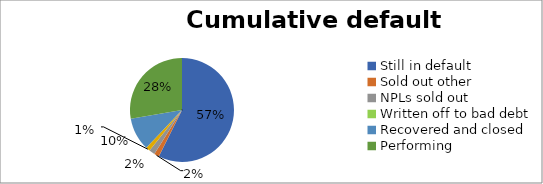
| Category | Series 1 | Series 0 |
|---|---|---|
| 0 | 0.574 |  |
| 1 | 0.016 |  |
| 2 | 0.018 |  |
| 3 | 0.013 |  |
| 4 | 0.102 |  |
| 5 | 0.277 |  |